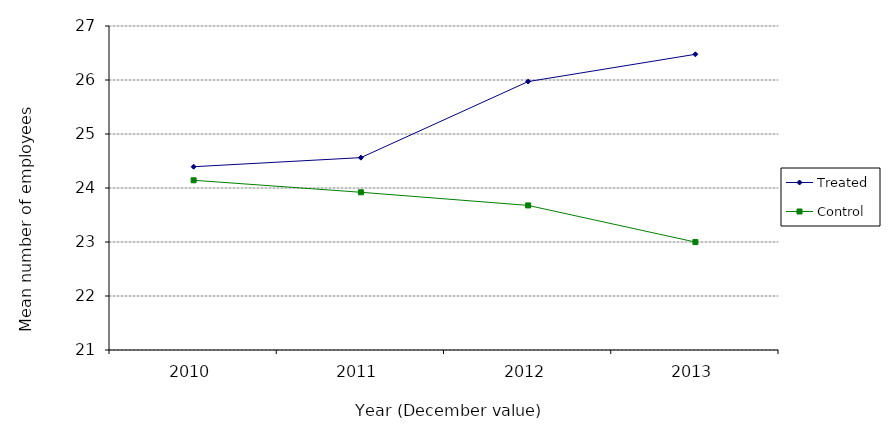
| Category | Treated | Control |
|---|---|---|
| 2010.0 | 24.394 | 24.143 |
| 2011.0 | 24.562 | 23.921 |
| 2012.0 | 25.971 | 23.678 |
| 2013.0 | 26.476 | 22.998 |